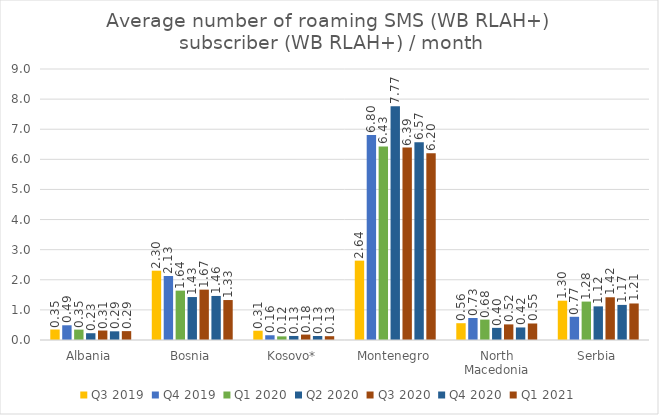
| Category | Q3 2019 | Q4 2019 | Q1 2020 | Q2 2020 | Q3 2020 | Q4 2020 | Q1 2021 |
|---|---|---|---|---|---|---|---|
| Albania | 0.348 | 0.489 | 0.345 | 0.225 | 0.315 | 0.288 | 0.295 |
| Bosnia | 2.301 | 2.126 | 1.64 | 1.427 | 1.673 | 1.463 | 1.327 |
| Kosovo* | 0.308 | 0.158 | 0.121 | 0.134 | 0.18 | 0.132 | 0.126 |
| Montenegro | 2.635 | 6.805 | 6.429 | 7.767 | 6.392 | 6.566 | 6.203 |
| North Macedonia | 0.558 | 0.73 | 0.678 | 0.403 | 0.518 | 0.417 | 0.548 |
| Serbia | 1.305 | 0.771 | 1.276 | 1.117 | 1.419 | 1.166 | 1.213 |